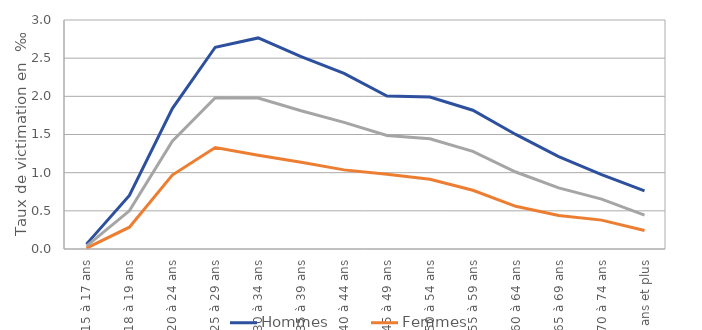
| Category | Hommes | Femmes | Ensemble |
|---|---|---|---|
| 15 à 17 ans | 0.064 | 0.01 | 0.038 |
| 18 à 19 ans | 0.702 | 0.286 | 0.5 |
| 20 à 24 ans | 1.839 | 0.969 | 1.411 |
| 25 à 29 ans | 2.643 | 1.329 | 1.981 |
| 30 à 34 ans | 2.765 | 1.227 | 1.977 |
| 35 à 39 ans | 2.52 | 1.137 | 1.811 |
| 40 à 44 ans | 2.302 | 1.036 | 1.659 |
| 45 à 49 ans | 2.005 | 0.98 | 1.488 |
| 50 à 54 ans | 1.99 | 0.913 | 1.444 |
| 55 à 59 ans | 1.818 | 0.77 | 1.28 |
| 60 à 64 ans | 1.501 | 0.559 | 1.009 |
| 65 à 69 ans | 1.211 | 0.44 | 0.801 |
| 70 à 74 ans | 0.974 | 0.378 | 0.654 |
| 75 ans et plus | 0.76 | 0.242 | 0.444 |